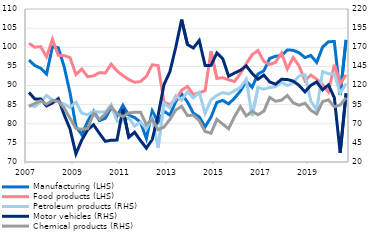
| Category | Manufacturing (LHS) | Food products (LHS) |
|---|---|---|
| 2007 | 96.651 | 101.028 |
| II | 95.21 | 100.002 |
| III | 94.499 | 100.166 |
| IV | 92.976 | 97.51 |
| 2008 | 100.116 | 102.085 |
| II | 99.884 | 97.915 |
| III | 94.879 | 97.809 |
| IV | 88.057 | 97.293 |
| 2009 | 79.311 | 92.848 |
| II | 77.148 | 94.307 |
| III | 80.58 | 92.296 |
| IV | 83.296 | 92.52 |
| 2010 | 80.822 | 93.363 |
| II | 81.431 | 93.266 |
| III | 84.198 | 95.591 |
| IV | 82.013 | 93.805 |
| 2011 | 84.817 | 92.572 |
| II | 82.209 | 91.545 |
| III | 81.633 | 90.844 |
| IV | 80.389 | 91.028 |
| 2012 | 76.134 | 92.405 |
| II | 83.348 | 95.422 |
| III | 80.439 | 95.199 |
| IV | 83.276 | 85.639 |
| 2013 | 82.255 | 85.006 |
| II | 85.815 | 86.298 |
| III | 87.826 | 88.768 |
| IV | 85.67 | 89.756 |
| 2014 | 82.759 | 87.633 |
| II | 81.779 | 88.108 |
| III | 79.196 | 88.628 |
| IV | 81.726 | 98.937 |
| 2015 | 85.571 | 91.842 |
| II | 86.101 | 92.036 |
| III | 85.188 | 91.492 |
| IV | 86.664 | 91.028 |
| 2016 | 88.527 | 93.074 |
| II | 91.119 | 95.676 |
| III | 89.544 | 98.05 |
| IV | 92.993 | 99.141 |
| 2017 | 93.84 | 96.292 |
| II | 97.075 | 95.511 |
| III | 97.66 | 96.078 |
| IV | 97.761 | 98.529 |
| 2018 | 99.301 | 94.312 |
| II | 99.211 | 97.327 |
| III | 98.565 | 95.111 |
| IV | 97.291 | 91.28 |
| 2019 | 97.862 | 92.716 |
| II | 96.034 | 91.667 |
| III | 100.027 | 90.215 |
| IV | 101.438 | 88.297 |
| 2020 | 101.495 | 95.428 |
| II | 87.515 | 90.467 |
| III | 101.946 | 92.751 |